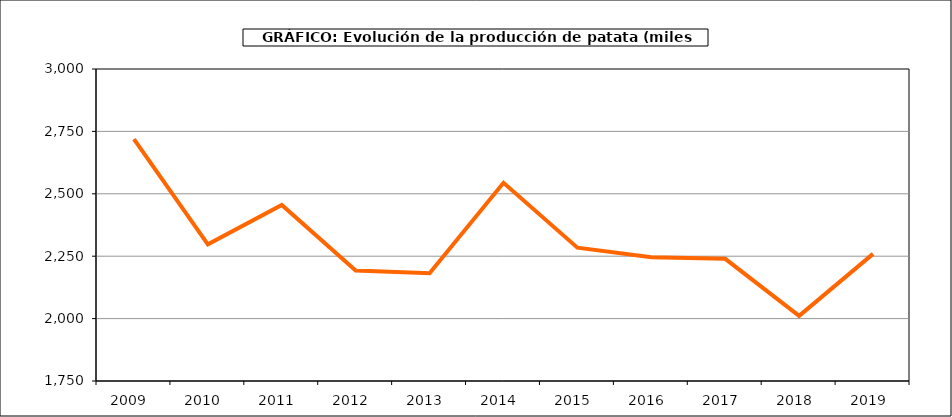
| Category | Producción |
|---|---|
| 2009.0 | 2719.291 |
| 2010.0 | 2297.649 |
| 2011.0 | 2455.101 |
| 2012.0 | 2192.284 |
| 2013.0 | 2182.082 |
| 2014.0 | 2544.009 |
| 2015.0 | 2284.073 |
| 2016.0 | 2246.204 |
| 2017.0 | 2239.47 |
| 2018.0 | 2010.933 |
| 2019.0 | 2259.32 |